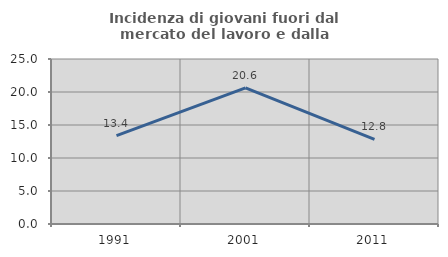
| Category | Incidenza di giovani fuori dal mercato del lavoro e dalla formazione  |
|---|---|
| 1991.0 | 13.392 |
| 2001.0 | 20.625 |
| 2011.0 | 12.814 |